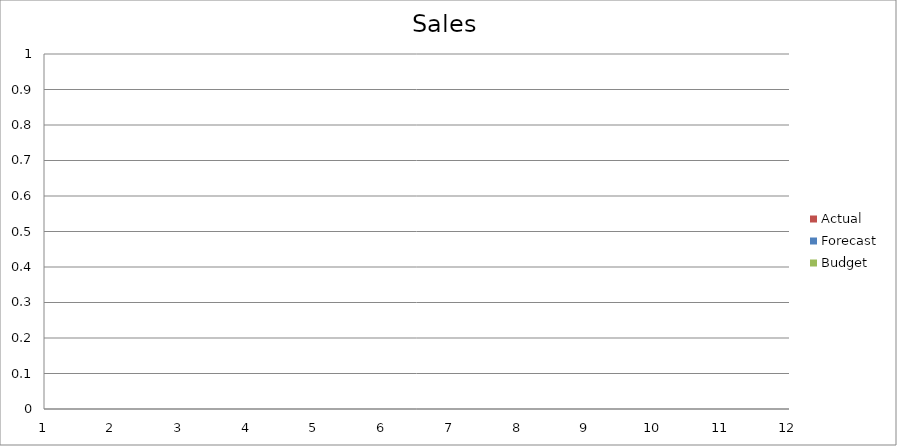
| Category | Budget | Forecast | Actual |
|---|---|---|---|
| 0 | 3310 | 600 | 1390 |
| 1 | 2210 | 2920 | 920 |
| 2 | 3500 | 2220 | 1000 |
| 3 | 2880 | 1830 | 1130 |
| 4 | 2350 | 2600 | 1620 |
| 5 | 3170 | 2910 | 1400 |
| 6 | 3280 | 1230 | 2660 |
| 7 | 1870 | 1670 | 1800 |
| 8 | 3220 | 700 | 820 |
| 9 | 2650 | 580 | 2290 |
| 10 | 2480 | 3030 | 1350 |
| 11 | 2900 | 1440 | 2790 |